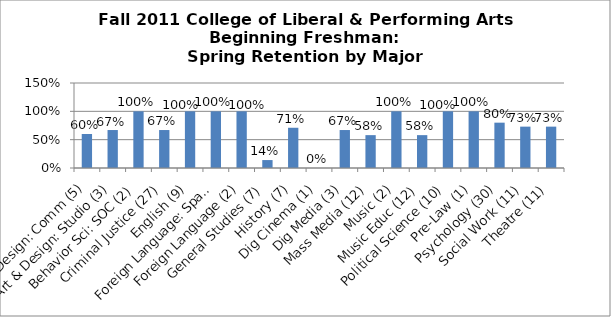
| Category | Series 0 |
|---|---|
| Art & Design: Comm (5) | 0.6 |
| Art & Design: Studio (3) | 0.67 |
| Behavior Sci: SOC (2) | 1 |
| Criminal Justice (27) | 0.67 |
| English (9) | 1 |
| Foreign Language: Spanish (1) | 1 |
| Foreign Language (2) | 1 |
| General Studies (7) | 0.14 |
| History (7) | 0.71 |
| Dig Cinema (1) | 0 |
| Dig Media (3) | 0.67 |
| Mass Media (12) | 0.58 |
| Music (2) | 1 |
| Music Educ (12) | 0.58 |
| Political Science (10) | 1 |
| Pre-Law (1) | 1 |
| Psychology (30) | 0.8 |
| Social Work (11) | 0.73 |
| Theatre (11) | 0.73 |